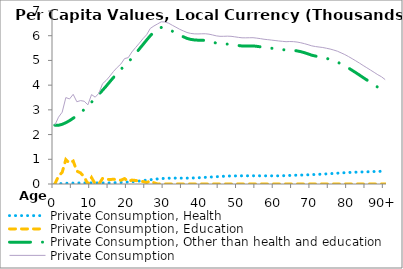
| Category | Private Consumption, Health | Private Consumption, Education | Private Consumption, Other than health and education | Private Consumption |
|---|---|---|---|---|
| 0 | 0 | 0 | 2380.687 | 2380.687 |
|  | 9.999 | 317.523 | 2375.79 | 2703.312 |
| 2 | 19.538 | 470.471 | 2415.206 | 2905.215 |
| 3 | 27.036 | 990.213 | 2480.259 | 3497.507 |
| 4 | 32.741 | 845.497 | 2562.874 | 3441.113 |
| 5 | 37.095 | 928.93 | 2661.975 | 3628 |
| 6 | 40.295 | 521.796 | 2765.352 | 3327.444 |
| 7 | 42.634 | 450.218 | 2881.899 | 3374.751 |
| 8 | 44.005 | 290.572 | 3014.445 | 3349.022 |
| 9 | 45.819 | 0 | 3156.519 | 3202.338 |
| 10 | 45.98 | 260.935 | 3310.281 | 3617.195 |
| 11 | 46.407 | 0 | 3467.42 | 3513.827 |
| 12 | 45.603 | 0 | 3627.307 | 3672.909 |
| 13 | 43.231 | 223.976 | 3792.371 | 4059.578 |
| 14 | 42.084 | 189.74 | 3960.567 | 4192.391 |
| 15 | 44.253 | 182.011 | 4140.642 | 4366.906 |
| 16 | 49.614 | 192.218 | 4314.129 | 4555.961 |
| 17 | 55.053 | 175.679 | 4487.109 | 4717.842 |
| 18 | 62.226 | 152.557 | 4640.506 | 4855.289 |
| 19 | 69.638 | 219.054 | 4785.653 | 5074.346 |
| 20 | 80.105 | 98.886 | 4934.17 | 5113.161 |
| 21 | 91.772 | 159.131 | 5093.102 | 5344.006 |
| 22 | 104.568 | 143.683 | 5272.666 | 5520.916 |
| 23 | 120.086 | 116.118 | 5458.558 | 5694.763 |
| 24 | 137.901 | 100.792 | 5639.885 | 5878.578 |
| 25 | 155.875 | 57.861 | 5822.831 | 6036.567 |
| 26 | 172.925 | 122.451 | 5998.391 | 6293.768 |
| 27 | 190.149 | 50.288 | 6153.519 | 6393.956 |
| 28 | 205.627 | 0.799 | 6270.195 | 6476.621 |
| 29 | 219.677 | 10.238 | 6332.306 | 6562.221 |
| 30 | 228.264 | 0.062 | 6326.316 | 6554.642 |
| 31 | 234.693 | 0 | 6271.136 | 6505.829 |
| 32 | 238.233 | 0 | 6185.058 | 6423.291 |
| 33 | 238.914 | 7.119 | 6097.232 | 6343.265 |
| 34 | 237.621 | 0 | 6023.81 | 6261.43 |
| 35 | 236.966 | 0 | 5957.975 | 6194.942 |
| 36 | 238.459 | 0 | 5892.769 | 6131.228 |
| 37 | 241.313 | 0.784 | 5851.539 | 6093.636 |
| 38 | 246.174 | 0 | 5829.441 | 6075.615 |
| 39 | 252.776 | 0 | 5819.567 | 6072.343 |
| 40 | 260.535 | 0 | 5817.476 | 6078.012 |
| 41 | 269.117 | 0 | 5810.295 | 6079.412 |
| 42 | 277.535 | 0 | 5785.087 | 6062.622 |
| 43 | 286.263 | 0 | 5743.695 | 6029.958 |
| 44 | 294.797 | 0 | 5698.875 | 5993.672 |
| 45 | 303.975 | 0 | 5671.668 | 5975.643 |
| 46 | 313.085 | 0 | 5663.066 | 5976.151 |
| 47 | 320.34 | 0 | 5661.295 | 5981.635 |
| 48 | 325.225 | 0 | 5650.721 | 5975.946 |
| 49 | 327.501 | 0 | 5628.67 | 5956.171 |
| 50 | 329.774 | 0 | 5603.256 | 5933.03 |
| 51 | 330.599 | 0 | 5584.927 | 5915.526 |
| 52 | 331.698 | 0 | 5582.377 | 5914.075 |
| 53 | 331.849 | 0 | 5585.929 | 5917.778 |
| 54 | 331.894 | 0 | 5587.774 | 5919.668 |
| 55 | 331.308 | 0 | 5571.131 | 5902.439 |
| 56 | 330.912 | 0 | 5550.694 | 5881.605 |
| 57 | 330.684 | 0 | 5526.027 | 5856.711 |
| 58 | 330.234 | 0 | 5510.442 | 5840.677 |
| 59 | 330.551 | 0 | 5492.664 | 5823.215 |
| 60 | 330.342 | 0 | 5475.161 | 5805.503 |
| 61 | 331.196 | 0 | 5456.715 | 5787.911 |
| 62 | 334.81 | 0 | 5437.665 | 5772.475 |
| 63 | 339.536 | 0 | 5418.482 | 5758.019 |
| 64 | 346.47 | 0 | 5418.621 | 5765.09 |
| 65 | 353.448 | 0 | 5407.201 | 5760.649 |
| 66 | 357.397 | 0 | 5385.864 | 5743.261 |
| 67 | 360.704 | 0 | 5354.658 | 5715.363 |
| 68 | 365.469 | 0 | 5313.418 | 5678.887 |
| 69 | 371.716 | 0 | 5264.738 | 5636.453 |
| 70 | 378.557 | 0 | 5211.271 | 5589.828 |
| 71 | 385.155 | 0 | 5176.669 | 5561.825 |
| 72 | 392.216 | 0 | 5149.475 | 5541.691 |
| 73 | 400.075 | 0 | 5122.623 | 5522.698 |
| 74 | 408.848 | 0 | 5083.91 | 5492.757 |
| 75 | 418.407 | 0 | 5042.433 | 5460.84 |
| 76 | 428.453 | 0 | 4991.426 | 5419.879 |
| 77 | 438.663 | 0 | 4933.972 | 5372.635 |
| 78 | 447.759 | 0 | 4857.943 | 5305.702 |
| 79 | 456.902 | 0 | 4780.848 | 5237.75 |
| 80 | 464.704 | 0 | 4692.486 | 5157.19 |
| 81 | 471.835 | 0 | 4599.792 | 5071.626 |
| 82 | 478.134 | 0 | 4504.839 | 4982.973 |
| 83 | 483.112 | 0 | 4407.846 | 4890.958 |
| 84 | 488.304 | 0 | 4306.637 | 4794.941 |
| 85 | 493.401 | 0 | 4210.05 | 4703.452 |
| 86 | 498.462 | 0 | 4112.905 | 4611.367 |
| 87 | 503.507 | 0 | 4014.163 | 4517.67 |
| 88 | 508.533 | 0 | 3913.125 | 4421.658 |
| 89 | 513.539 | 0 | 3825.113 | 4338.653 |
| 90+ | 514.999 | 0 | 3708.936 | 4223.935 |